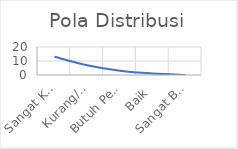
| Category | Pola Distribusi |
|---|---|
| Sangat Kurang | 13 |
| Kurang/Misconduct | 7 |
| Butuh Perbaikan | 3 |
| Baik | 1 |
| Sangat Baik | 0 |